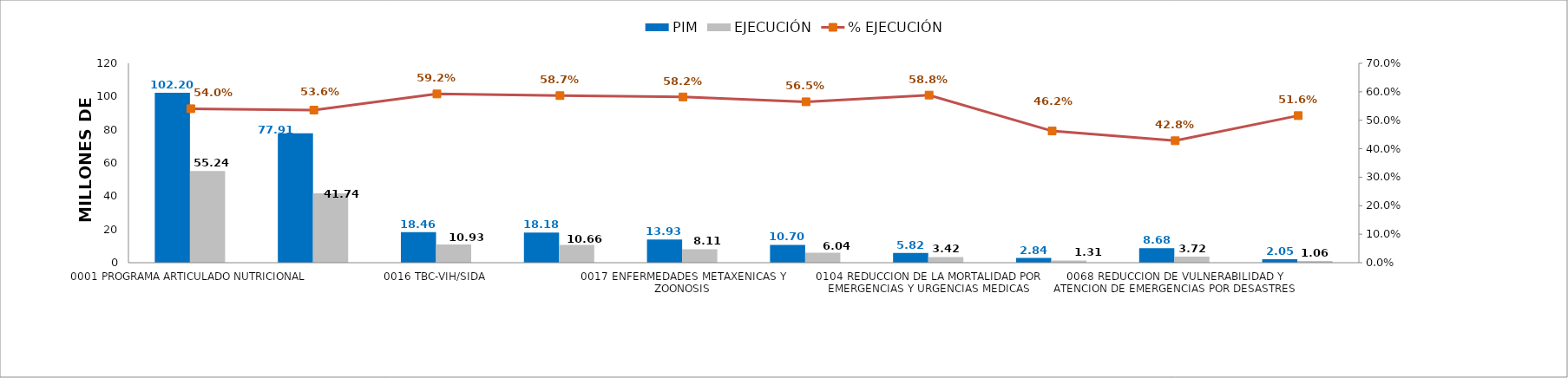
| Category | PIM | EJECUCIÓN |
|---|---|---|
| 0001 PROGRAMA ARTICULADO NUTRICIONAL | 102.205 | 55.239 |
| 0002 SALUD MATERNO NEONATAL | 77.906 | 41.745 |
| 0016 TBC-VIH/SIDA | 18.456 | 10.935 |
| 0018 ENFERMEDADES NO TRANSMISIBLES | 18.179 | 10.664 |
| 0017 ENFERMEDADES METAXENICAS Y ZOONOSIS | 13.932 | 8.107 |
| 0024 PREVENCION Y CONTROL DEL CANCER | 10.701 | 6.043 |
| 0104 REDUCCION DE LA MORTALIDAD POR EMERGENCIAS Y URGENCIAS MEDICAS | 5.817 | 3.422 |
| 0131 CONTROL Y PREVENCION EN SALUD MENTAL | 2.835 | 1.311 |
| 0068 REDUCCION DE VULNERABILIDAD Y ATENCION DE EMERGENCIAS POR DESASTRES | 8.678 | 3.716 |
| 0129 PREVENCION Y MANEJO DE CONDICIONES SECUNDARIAS DE SALUD EN PERSONAS CON DISCAPACIDAD | 2.05 | 1.058 |